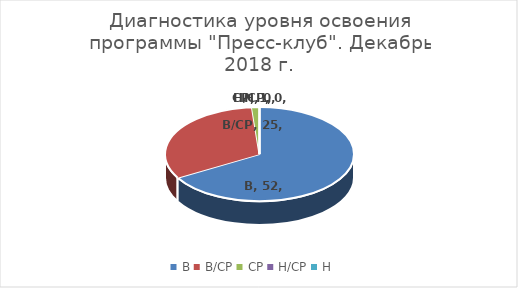
| Category | Series 0 |
|---|---|
| В | 52 |
| В/СР | 25 |
| СР | 1 |
| Н/СР | 0 |
| Н | 0 |